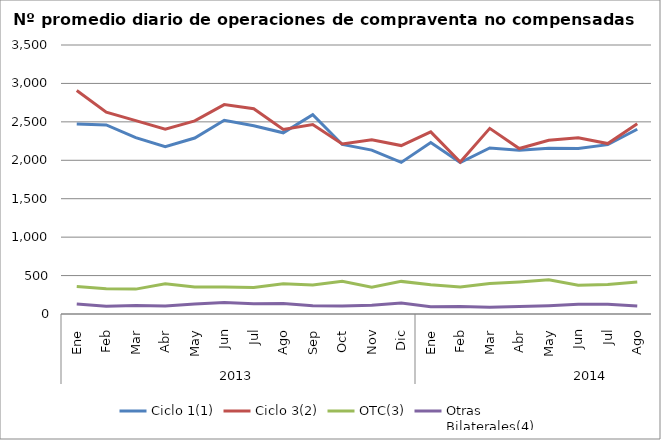
| Category | Ciclo 1(1) | Ciclo 3(2) | OTC(3) | Otras
Bilaterales(4) |
|---|---|---|---|---|
| 0 | 2472.091 | 2907.273 | 357.864 | 131.409 |
| 1 | 2459.8 | 2626.25 | 327.5 | 100.6 |
| 2 | 2294.6 | 2516 | 323.75 | 111.65 |
| 3 | 2176.182 | 2403.364 | 394.818 | 103.364 |
| 4 | 2290.048 | 2512.714 | 352.095 | 130.143 |
| 5 | 2520.75 | 2724.25 | 349.7 | 151.05 |
| 6 | 2449.045 | 2670.182 | 344.818 | 134.5 |
| 7 | 2357.333 | 2400.048 | 392.524 | 137.571 |
| 8 | 2593.778 | 2465 | 376.889 | 108.389 |
| 9 | 2205.955 | 2213.318 | 425.318 | 105.636 |
| 10 | 2132.1 | 2268.1 | 350 | 113.75 |
| 11 | 1972.35 | 2191.55 | 424.35 | 141.55 |
| 12 | 2231.227 | 2368.955 | 379.864 | 95 |
| 13 | 1969.85 | 1978.25 | 352.25 | 97.9 |
| 14 | 2160.619 | 2415.286 | 395.857 | 87.762 |
| 15 | 2130.667 | 2153.048 | 416.143 | 96 |
| 16 | 2155.9 | 2259.8 | 444.8 | 108.2 |
| 17 | 2153.571 | 2294.381 | 375.286 | 126.095 |
| 18 | 2203.545 | 2217.727 | 382.409 | 125.409 |
| 19 | 2404.35 | 2474.4 | 416.2 | 102.85 |